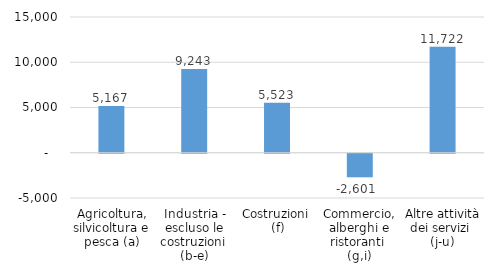
| Category | Series 0 |
|---|---|
| Agricoltura, silvicoltura e pesca (a) | 5167 |
| Industria - escluso le costruzioni 
(b-e) | 9243 |
| Costruzioni 
(f) | 5523 |
| Commercio, alberghi e ristoranti 
(g,i) | -2601 |
| Altre attività dei servizi 
(j-u) | 11722 |